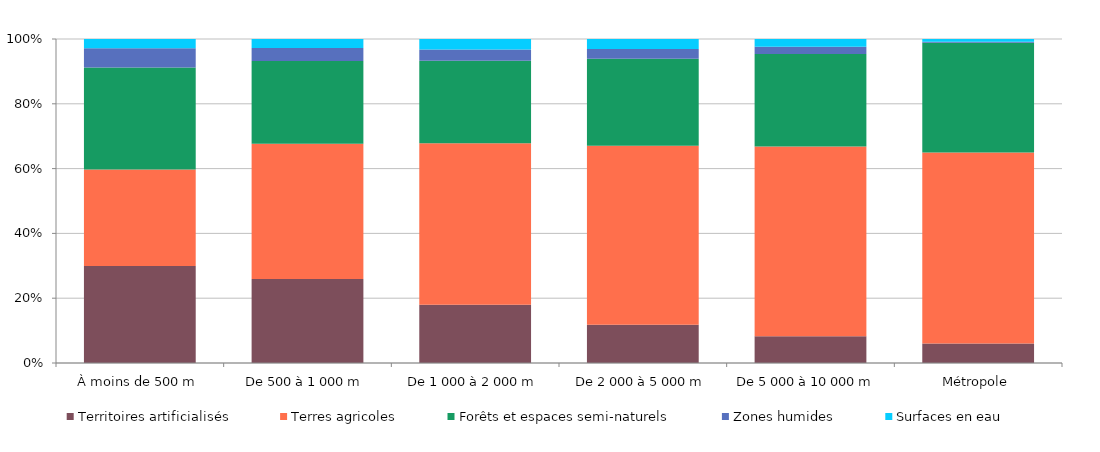
| Category | Territoires artificialisés | Terres agricoles | Forêts et espaces semi-naturels | Zones humides | Surfaces en eau |
|---|---|---|---|---|---|
| À moins de 500 m | 0.299 | 0.298 | 0.315 | 0.06 | 0.028 |
| De 500 à 1 000 m | 0.259 | 0.417 | 0.256 | 0.04 | 0.027 |
| De 1 000 à 2 000 m | 0.18 | 0.498 | 0.254 | 0.035 | 0.033 |
| De 2 000 à 5 000 m | 0.118 | 0.552 | 0.269 | 0.03 | 0.031 |
| De 5 000 à 10 000 m  | 0.083 | 0.586 | 0.285 | 0.022 | 0.024 |
| Métropole | 0.06 | 0.59 | 0.339 | 0.003 | 0.008 |